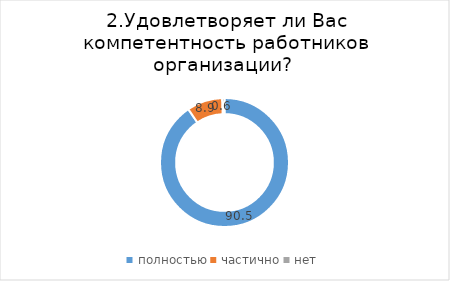
| Category | Series 0 |
|---|---|
| полностью | 90.517 |
| частично | 8.931 |
| нет | 0.552 |